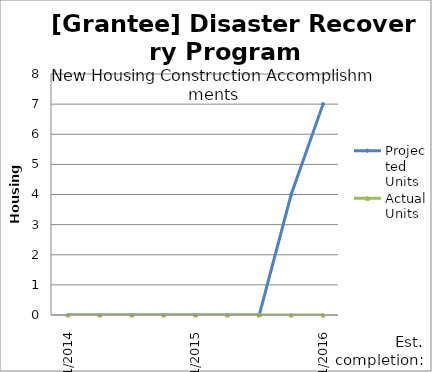
| Category | Projected Units | Actual Units |
|---|---|---|
| 1/2014 | 0 | 0 |
| 4/2014 | 0 | 0 |
| 7/2014 | 0 | 0 |
| 10/2014 | 0 | 0 |
| 1/2015 | 0 | 0 |
| 4/2015 | 0 | 0 |
| 7/2015 | 0 | 0 |
| 10/2015 | 4 | 0 |
| 1/2016 | 7 | 0 |